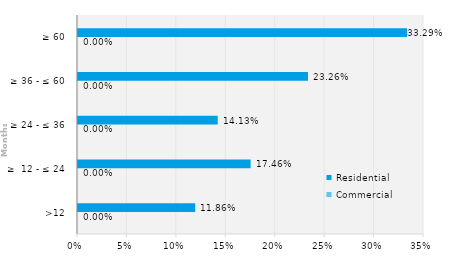
| Category | Commercial | Residential |
|---|---|---|
| >12 | 0 | 0.119 |
| ≥  12 - ≤ 24 | 0 | 0.175 |
| ≥ 24 - ≤ 36 | 0 | 0.141 |
| ≥ 36 - ≤ 60 | 0 | 0.233 |
| ≥ 60 | 0 | 0.333 |